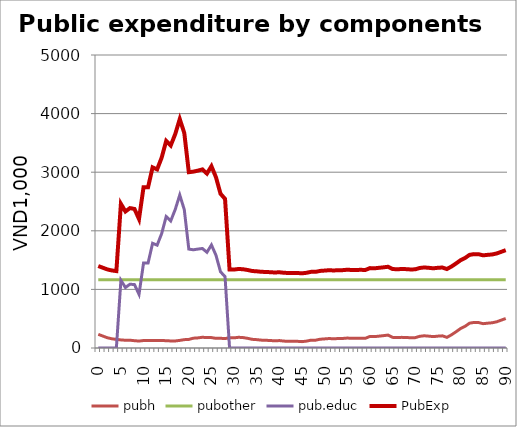
| Category | pubh | pubother | pub.educ | PubExp |
|---|---|---|---|---|
| 0.0 | 232.794 | 1165.922 | 0 | 1398.716 |
| 1.0 | 203.914 | 1165.922 | 0 | 1369.835 |
| 2.0 | 175.033 | 1165.922 | 0 | 1340.955 |
| 3.0 | 157.249 | 1165.922 | 0 | 1323.17 |
| 4.0 | 146.7 | 1165.922 | 0 | 1312.622 |
| 5.0 | 137.829 | 1165.922 | 1156.379 | 2460.129 |
| 6.0 | 132.264 | 1165.922 | 1031.65 | 2329.836 |
| 7.0 | 132.979 | 1165.922 | 1088.655 | 2387.556 |
| 8.0 | 124.421 | 1165.922 | 1082.099 | 2372.442 |
| 9.0 | 118.552 | 1165.922 | 915.948 | 2200.421 |
| 10.0 | 127.742 | 1165.922 | 1450 | 2743.664 |
| 11.0 | 128.496 | 1165.922 | 1449.537 | 2743.955 |
| 12.0 | 129.864 | 1165.922 | 1786.843 | 3082.629 |
| 13.0 | 127.26 | 1165.922 | 1754.905 | 3048.087 |
| 14.0 | 130.046 | 1165.922 | 1951.498 | 3247.465 |
| 15.0 | 123.538 | 1165.922 | 2243.266 | 3532.725 |
| 16.0 | 120.886 | 1165.922 | 2168.065 | 3454.872 |
| 17.0 | 120.191 | 1165.922 | 2364.326 | 3650.439 |
| 18.0 | 129.585 | 1165.922 | 2611.116 | 3906.622 |
| 19.0 | 142.453 | 1165.922 | 2360.891 | 3669.265 |
| 20.0 | 146.291 | 1165.922 | 1688 | 3000.212 |
| 21.0 | 167.597 | 1165.922 | 1675.998 | 3009.517 |
| 22.0 | 172.463 | 1165.922 | 1688.152 | 3026.536 |
| 23.0 | 183.39 | 1165.922 | 1698.145 | 3047.456 |
| 24.0 | 177.068 | 1165.922 | 1633.273 | 2976.262 |
| 25.0 | 177.278 | 1165.922 | 1758.575 | 3101.774 |
| 26.0 | 164.655 | 1165.922 | 1582.923 | 2913.499 |
| 27.0 | 165.544 | 1165.922 | 1301.196 | 2632.661 |
| 28.0 | 161.069 | 1165.922 | 1217.785 | 2544.776 |
| 29.0 | 173.482 | 1165.922 | 0 | 1339.404 |
| 30.0 | 173.186 | 1165.922 | 0 | 1339.107 |
| 31.0 | 182.897 | 1165.922 | 0 | 1348.819 |
| 32.0 | 177.593 | 1165.922 | 0 | 1343.515 |
| 33.0 | 165.092 | 1165.922 | 0 | 1331.014 |
| 34.0 | 147.944 | 1165.922 | 0 | 1313.866 |
| 35.0 | 142.689 | 1165.922 | 0 | 1308.611 |
| 36.0 | 134.406 | 1165.922 | 0 | 1300.328 |
| 37.0 | 131.641 | 1165.922 | 0 | 1297.563 |
| 38.0 | 127.756 | 1165.922 | 0 | 1293.678 |
| 39.0 | 122.538 | 1165.922 | 0 | 1288.459 |
| 40.0 | 126.696 | 1165.922 | 0 | 1292.617 |
| 41.0 | 118.012 | 1165.922 | 0 | 1283.933 |
| 42.0 | 113.73 | 1165.922 | 0 | 1279.652 |
| 43.0 | 114.447 | 1165.922 | 0 | 1280.368 |
| 44.0 | 113.857 | 1165.922 | 0 | 1279.779 |
| 45.0 | 108.666 | 1165.922 | 0 | 1274.588 |
| 46.0 | 117.405 | 1165.922 | 0 | 1283.327 |
| 47.0 | 133.895 | 1165.922 | 0 | 1299.816 |
| 48.0 | 133.602 | 1165.922 | 0 | 1299.523 |
| 49.0 | 149.504 | 1165.922 | 0 | 1315.426 |
| 50.0 | 155.261 | 1165.922 | 0 | 1321.182 |
| 51.0 | 161.503 | 1165.922 | 0 | 1327.424 |
| 52.0 | 156.953 | 1165.922 | 0 | 1322.874 |
| 53.0 | 161.824 | 1165.922 | 0 | 1327.745 |
| 54.0 | 162.762 | 1165.922 | 0 | 1328.684 |
| 55.0 | 169.686 | 1165.922 | 0 | 1335.608 |
| 56.0 | 165.532 | 1165.922 | 0 | 1331.453 |
| 57.0 | 166.08 | 1165.922 | 0 | 1332.001 |
| 58.0 | 167.967 | 1165.922 | 0 | 1333.888 |
| 59.0 | 165.579 | 1165.922 | 0 | 1331.501 |
| 60.0 | 197.405 | 1165.922 | 0 | 1363.327 |
| 61.0 | 194.153 | 1165.922 | 0 | 1360.075 |
| 62.0 | 202.318 | 1165.922 | 0 | 1368.239 |
| 63.0 | 210.742 | 1165.922 | 0 | 1376.664 |
| 64.0 | 220.311 | 1165.922 | 0 | 1386.232 |
| 65.0 | 181.523 | 1165.922 | 0 | 1347.445 |
| 66.0 | 178.122 | 1165.922 | 0 | 1344.044 |
| 67.0 | 181.556 | 1165.922 | 0 | 1347.477 |
| 68.0 | 179.886 | 1165.922 | 0 | 1345.808 |
| 69.0 | 174.3 | 1165.922 | 0 | 1340.222 |
| 70.0 | 176.66 | 1165.922 | 0 | 1342.582 |
| 71.0 | 199.457 | 1165.922 | 0 | 1365.379 |
| 72.0 | 208.669 | 1165.922 | 0 | 1374.591 |
| 73.0 | 202.296 | 1165.922 | 0 | 1368.218 |
| 74.0 | 194.237 | 1165.922 | 0 | 1360.159 |
| 75.0 | 202.457 | 1165.922 | 0 | 1368.379 |
| 76.0 | 207.457 | 1165.922 | 0 | 1373.379 |
| 77.0 | 181.292 | 1165.922 | 0 | 1347.214 |
| 78.0 | 224.166 | 1165.922 | 0 | 1390.087 |
| 79.0 | 275.449 | 1165.922 | 0 | 1441.37 |
| 80.0 | 330.736 | 1165.922 | 0 | 1496.657 |
| 81.0 | 368.989 | 1165.922 | 0 | 1534.911 |
| 82.0 | 423.194 | 1165.922 | 0 | 1589.116 |
| 83.0 | 436.042 | 1165.922 | 0 | 1601.964 |
| 84.0 | 434.393 | 1165.922 | 0 | 1600.315 |
| 85.0 | 415.151 | 1165.922 | 0 | 1581.072 |
| 86.0 | 423.44 | 1165.922 | 0 | 1589.362 |
| 87.0 | 430.379 | 1165.922 | 0 | 1596.301 |
| 88.0 | 447.088 | 1165.922 | 0 | 1613.009 |
| 89.0 | 475.333 | 1165.922 | 0 | 1641.254 |
| 90.0 | 503.577 | 1165.922 | 0 | 1669.499 |